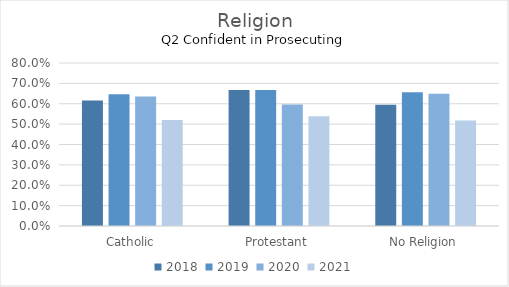
| Category | 2018 | 2019 | 2020 | 2021 |
|---|---|---|---|---|
| Catholic | 0.616 | 0.647 | 0.636 | 0.52 |
| Protestant | 0.667 | 0.668 | 0.596 | 0.538 |
| No Religion | 0.595 | 0.656 | 0.649 | 0.518 |